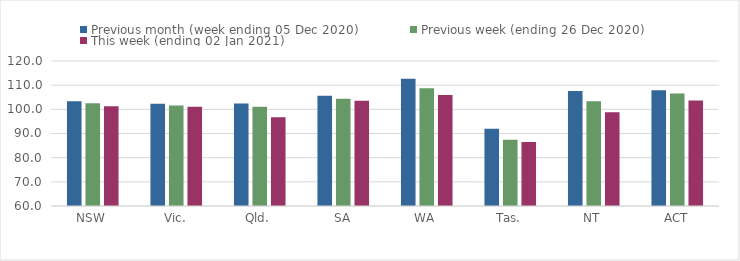
| Category | Previous month (week ending 05 Dec 2020) | Previous week (ending 26 Dec 2020) | This week (ending 02 Jan 2021) |
|---|---|---|---|
| NSW | 103.38 | 102.48 | 101.31 |
| Vic. | 102.31 | 101.63 | 101.04 |
| Qld. | 102.37 | 101.05 | 96.77 |
| SA | 105.57 | 104.35 | 103.52 |
| WA | 112.67 | 108.76 | 105.93 |
| Tas. | 91.96 | 87.43 | 86.52 |
| NT | 107.61 | 103.34 | 98.78 |
| ACT | 107.92 | 106.59 | 103.67 |